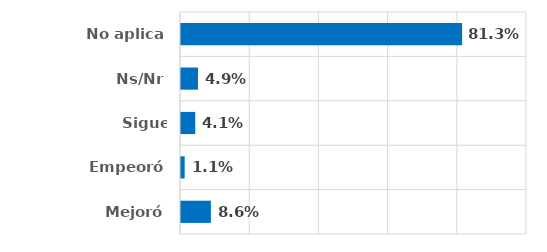
| Category | Series 0 |
|---|---|
| Mejoró | 0.086 |
| Empeoró | 0.011 |
| Sigue igual | 0.041 |
| Ns/Nr | 0.049 |
| No aplica | 0.812 |